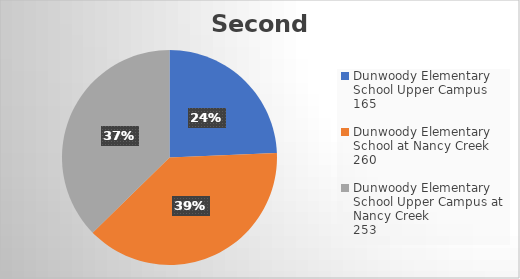
| Category | Series 0 |
|---|---|
| Dunwoody Elementary School Upper Campus
165 | 165 |
| Dunwoody Elementary School at Nancy Creek
260 | 260 |
| Dunwoody Elementary School Upper Campus at Nancy Creek
253 | 253 |